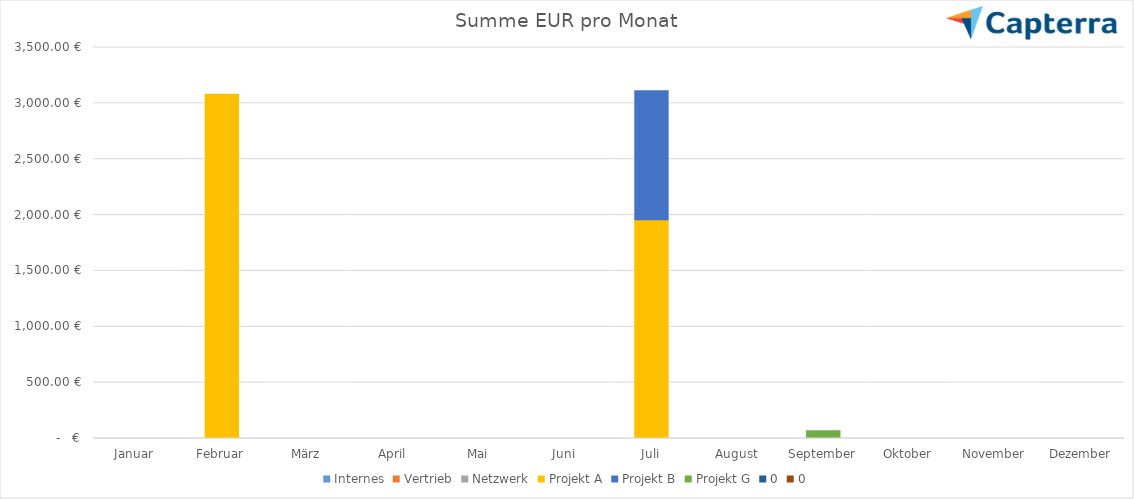
| Category | Internes | Vertrieb | Netzwerk | Projekt A | Projekt B | Projekt G | 0 |
|---|---|---|---|---|---|---|---|
| Januar | 0 | 0 | 0 | 0 | 0 | 0 | 0 |
| Februar | 0 | 0 | 0 | 3082.5 | 0 | 0 | 0 |
| März | 0 | 0 | 0 | 0 | 0 | 0 | 0 |
| April | 0 | 0 | 0 | 0 | 0 | 0 | 0 |
| Mai | 0 | 0 | 0 | 0 | 0 | 0 | 0 |
| Juni | 0 | 0 | 0 | 0 | 0 | 0 | 0 |
| Juli | 0 | 0 | 0 | 1957.5 | 1155 | 0 | 0 |
| August | 0 | 0 | 0 | 0 | 0 | 0 | 0 |
| September | 0 | 0 | 0 | 0 | 0 | 70 | 0 |
| Oktober | 0 | 0 | 0 | 0 | 0 | 0 | 0 |
| November | 0 | 0 | 0 | 0 | 0 | 0 | 0 |
| Dezember | 0 | 0 | 0 | 0 | 0 | 0 | 0 |